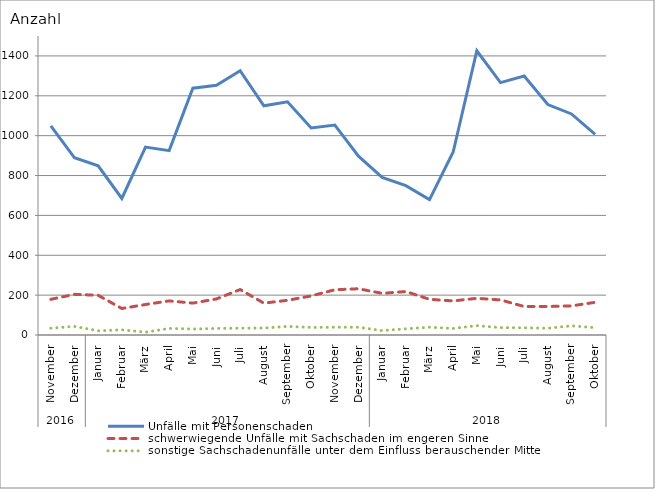
| Category | Unfälle mit Personenschaden | schwerwiegende Unfälle mit Sachschaden im engeren Sinne | sonstige Sachschadenunfälle unter dem Einfluss berauschender Mittel |
|---|---|---|---|
| 0 | 1049 | 179 | 34 |
| 1 | 889 | 204 | 43 |
| 2 | 849 | 199 | 21 |
| 3 | 685 | 133 | 26 |
| 4 | 943 | 153 | 14 |
| 5 | 925 | 171 | 33 |
| 6 | 1238 | 160 | 30 |
| 7 | 1253 | 181 | 33 |
| 8 | 1326 | 228 | 34 |
| 9 | 1150 | 160 | 35 |
| 10 | 1170 | 174 | 43 |
| 11 | 1039 | 196 | 38 |
| 12 | 1053 | 227 | 39 |
| 13 | 897 | 232 | 39 |
| 14 | 791 | 209 | 22 |
| 15 | 749 | 218 | 31 |
| 16 | 679 | 179 | 39 |
| 17 | 918 | 171 | 33 |
| 18 | 1426 | 184 | 47 |
| 19 | 1266 | 176 | 37 |
| 20 | 1299 | 143 | 36 |
| 21 | 1156 | 143 | 34 |
| 22 | 1109 | 146 | 46 |
| 23 | 1007 | 164 | 37 |